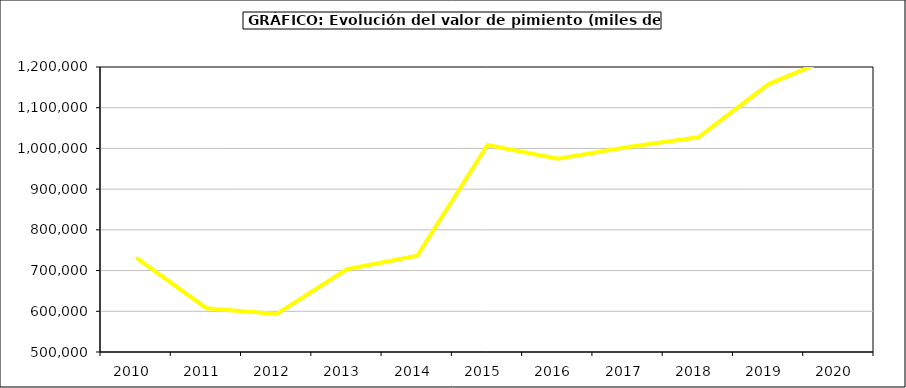
| Category | Valor |
|---|---|
| 2010.0 | 731583.218 |
| 2011.0 | 607528.309 |
| 2012.0 | 593530.063 |
| 2013.0 | 703328.169 |
| 2014.0 | 736417.986 |
| 2015.0 | 1008587 |
| 2016.0 | 974815 |
| 2017.0 | 1003610.326 |
| 2018.0 | 1027423.396 |
| 2019.0 | 1158111.218 |
| 2020.0 | 1229629.068 |